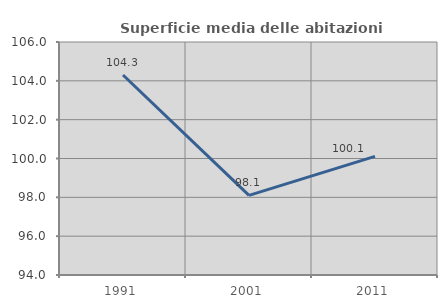
| Category | Superficie media delle abitazioni occupate |
|---|---|
| 1991.0 | 104.302 |
| 2001.0 | 98.099 |
| 2011.0 | 100.109 |